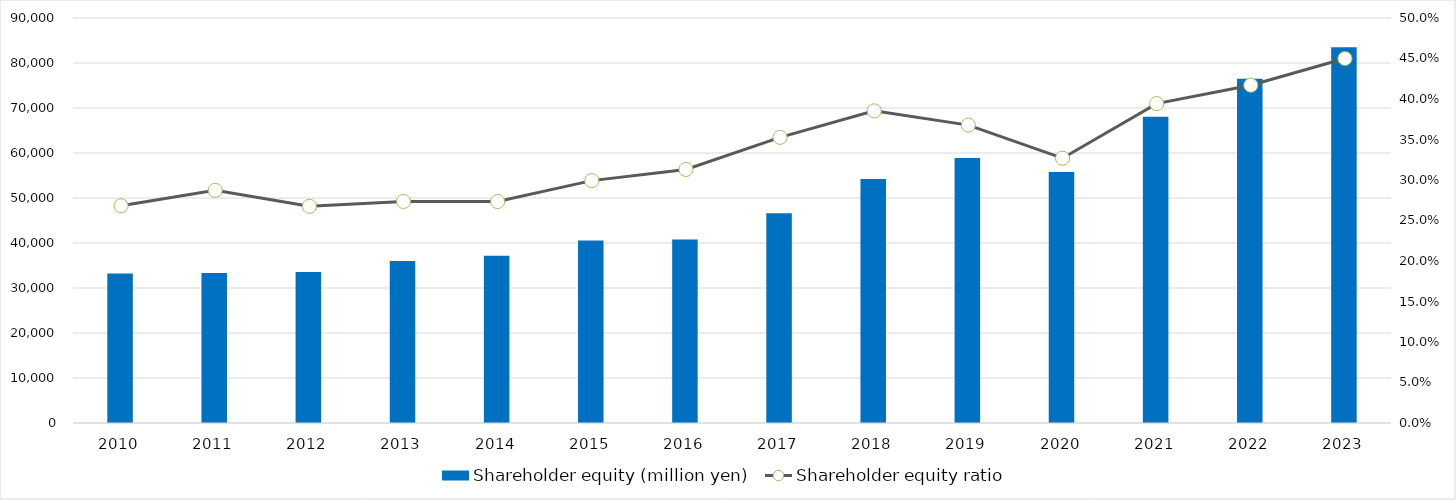
| Category | Shareholder equity (million yen) |
|---|---|
| 2010 | 33213 |
| 2011 | 33306 |
| 2012 | 33569 |
| 2013 | 36002 |
| 2014 | 37154 |
| 2015 | 40573 |
| 2016 | 40789 |
| 2017 | 46614 |
| 2018 | 54244 |
| 2019 | 58904 |
| 2020 | 55778 |
| 2021 | 68043 |
| 2022 | 76487 |
| 2023 | 83523.251 |